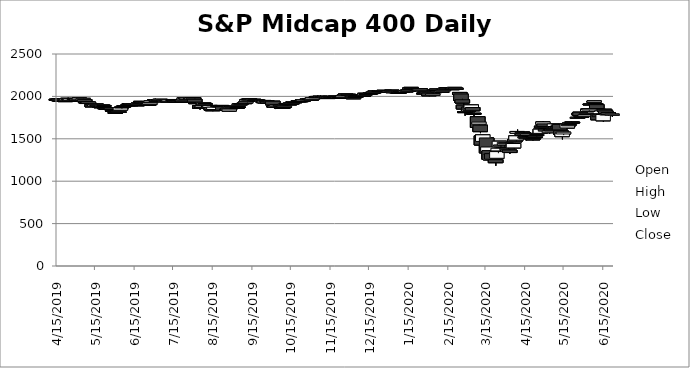
| Category | Open | High | Low | Close |
|---|---|---|---|---|
| 4/15/19 | 1966.51 | 1969.05 | 1958.46 | 1962.01 |
| 4/16/19 | 1966.48 | 1968.69 | 1958.73 | 1963.52 |
| 4/17/19 | 1968.53 | 1970.63 | 1944.52 | 1948.59 |
| 4/18/19 | 1948.67 | 1955.84 | 1942.2 | 1953.43 |
| 4/22/19 | 1950.25 | 1951.26 | 1940.24 | 1946.21 |
| 4/23/19 | 1949.71 | 1974.34 | 1949.71 | 1970.84 |
| 4/24/19 | 1973.05 | 1984.73 | 1972.45 | 1977.67 |
| 4/25/19 | 1970.99 | 1970.99 | 1945.44 | 1955.14 |
| 4/26/19 | 1955.57 | 1975.06 | 1953.91 | 1973.92 |
| 4/29/19 | 1974.74 | 1979.46 | 1971.18 | 1973.94 |
| 4/30/19 | 1973.55 | 1973.83 | 1953.93 | 1970.74 |
| 5/1/19 | 1972.97 | 1974.2 | 1948.83 | 1948.87 |
| 5/2/19 | 1946 | 1958.25 | 1934.3 | 1952.87 |
| 5/3/19 | 1960.55 | 1981.44 | 1960.55 | 1980.83 |
| 5/6/19 | 1956.87 | 1981.59 | 1952.53 | 1976.82 |
| 5/7/19 | 1962.69 | 1964.15 | 1926.4 | 1938.62 |
| 5/8/19 | 1936.06 | 1947.19 | 1931.67 | 1932.14 |
| 5/9/19 | 1918.87 | 1931.06 | 1901.67 | 1927.74 |
| 5/10/19 | 1922.67 | 1938.24 | 1898.47 | 1933.43 |
| 5/13/19 | 1907.51 | 1907.51 | 1870.38 | 1876.57 |
| 5/14/19 | 1881.99 | 1903.37 | 1881.25 | 1894.92 |
| 5/15/19 | 1883.24 | 1903.51 | 1878.37 | 1899.98 |
| 5/16/19 | 1903.67 | 1922.34 | 1903.52 | 1911.41 |
| 5/17/19 | 1898.45 | 1913.13 | 1888.2 | 1889.4 |
| 5/20/19 | 1878.11 | 1885.65 | 1870.73 | 1875.69 |
| 5/21/19 | 1884.42 | 1902.11 | 1884.42 | 1899.74 |
| 5/22/19 | 1893.18 | 1895.48 | 1880.92 | 1885.16 |
| 5/23/19 | 1868.64 | 1868.64 | 1844.36 | 1853.57 |
| 5/24/19 | 1861.53 | 1868.25 | 1855.68 | 1862.83 |
| 5/28/19 | 1864.68 | 1868.88 | 1843.84 | 1844.17 |
| 5/29/19 | 1835.01 | 1837.48 | 1821.07 | 1832.77 |
| 5/30/19 | 1834.12 | 1847.6 | 1820.1 | 1828.67 |
| 5/31/19 | 1812 | 1818.44 | 1802.58 | 1810.5 |
| 6/3/19 | 1813.48 | 1829.86 | 1811.71 | 1822.94 |
| 6/4/19 | 1837.8 | 1869.01 | 1837.36 | 1868.82 |
| 6/5/19 | 1874.66 | 1877.01 | 1854.08 | 1874.71 |
| 6/6/19 | 1875.59 | 1885.87 | 1865.45 | 1881.52 |
| 6/7/19 | 1886.84 | 1899.5 | 1885.55 | 1892 |
| 6/10/19 | 1899.15 | 1914.01 | 1899.01 | 1902.19 |
| 6/11/19 | 1914.4 | 1921.8 | 1897.95 | 1903.88 |
| 6/12/19 | 1901.24 | 1903.92 | 1894.42 | 1901.72 |
| 6/13/19 | 1907.8 | 1913.39 | 1902.64 | 1912.45 |
| 6/14/19 | 1908.98 | 1908.98 | 1898.01 | 1899.92 |
| 6/17/19 | 1900.97 | 1908 | 1897.84 | 1899.56 |
| 6/18/19 | 1908.54 | 1933.61 | 1908.54 | 1921.35 |
| 6/19/19 | 1922.61 | 1928.75 | 1918.66 | 1926.95 |
| 6/20/19 | 1941.58 | 1946.18 | 1926.95 | 1939.94 |
| 6/21/19 | 1934.36 | 1936.49 | 1923.02 | 1928.11 |
| 6/24/19 | 1930.76 | 1931.86 | 1912.65 | 1912.65 |
| 6/25/19 | 1913.96 | 1915.69 | 1900.45 | 1901.33 |
| 6/26/19 | 1907.46 | 1912.08 | 1898.62 | 1898.62 |
| 6/27/19 | 1903.52 | 1923.27 | 1903.52 | 1922.3 |
| 6/28/19 | 1927.02 | 1947.94 | 1927.02 | 1945.51 |
| 7/1/19 | 1963.09 | 1973.1 | 1943.44 | 1952.38 |
| 7/2/19 | 1951.14 | 1952.22 | 1939.61 | 1946.19 |
| 7/3/19 | 1951 | 1963.6 | 1950.03 | 1963.42 |
| 7/5/19 | 1955.82 | 1965.95 | 1943.1 | 1965.95 |
| 7/8/19 | 1958.51 | 1960.5 | 1944.09 | 1947.42 |
| 7/9/19 | 1939.49 | 1947.53 | 1936.47 | 1947.21 |
| 7/10/19 | 1954.61 | 1958.44 | 1941.85 | 1945.83 |
| 7/11/19 | 1947.82 | 1948.1 | 1932.97 | 1940.63 |
| 7/12/19 | 1943.45 | 1963.53 | 1943.45 | 1960.49 |
| 7/15/19 | 1963.5 | 1965.19 | 1947.35 | 1951.36 |
| 7/16/19 | 1947.39 | 1957.82 | 1944.47 | 1951.83 |
| 7/17/19 | 1950.24 | 1950.93 | 1935.8 | 1937.47 |
| 7/18/19 | 1935.48 | 1946.64 | 1931.71 | 1943.6 |
| 7/19/19 | 1947.05 | 1954.59 | 1937.24 | 1937.4 |
| 7/22/19 | 1940.22 | 1944.78 | 1934.8 | 1935.64 |
| 7/23/19 | 1942.97 | 1956.61 | 1939.67 | 1956.2 |
| 7/24/19 | 1954.51 | 1985.37 | 1954.14 | 1983.8 |
| 7/25/19 | 1981.61 | 1981.61 | 1962.93 | 1964.83 |
| 7/26/19 | 1968.92 | 1985.4 | 1968.8 | 1983.14 |
| 7/29/19 | 1982.65 | 1983.95 | 1971.11 | 1973.88 |
| 7/30/19 | 1966 | 1986.88 | 1959.63 | 1986.8 |
| 7/31/19 | 1985.72 | 1991.51 | 1956.34 | 1966.72 |
| 8/1/19 | 1966.56 | 1977.23 | 1926.54 | 1933.48 |
| 8/2/19 | 1926.3 | 1927.19 | 1902.9 | 1914.53 |
| 8/5/19 | 1892.55 | 1892.55 | 1843.73 | 1860.83 |
| 8/6/19 | 1868.67 | 1884.38 | 1860.57 | 1883.5 |
| 8/7/19 | 1868.54 | 1892.33 | 1853.81 | 1887.31 |
| 8/8/19 | 1897.67 | 1925.57 | 1897.67 | 1925.31 |
| 8/9/19 | 1916.45 | 1917.06 | 1896.08 | 1901.33 |
| 8/12/19 | 1892.09 | 1892.09 | 1868.81 | 1872.8 |
| 8/13/19 | 1870.85 | 1912.03 | 1866.66 | 1893.51 |
| 8/14/19 | 1869.92 | 1869.92 | 1836.51 | 1837.99 |
| 8/15/19 | 1842.85 | 1844.37 | 1826.08 | 1835.16 |
| 8/16/19 | 1845.11 | 1875.34 | 1845.1 | 1873.22 |
| 8/19/19 | 1892.48 | 1898.26 | 1889.42 | 1891.71 |
| 8/20/19 | 1888.11 | 1888.11 | 1875.71 | 1876.3 |
| 8/21/19 | 1889.53 | 1891.79 | 1884.17 | 1886.86 |
| 8/22/19 | 1893.41 | 1897.43 | 1878.45 | 1888.46 |
| 8/23/19 | 1878.12 | 1887.05 | 1832.28 | 1836.55 |
| 8/26/19 | 1852.05 | 1853.5 | 1838.79 | 1851.39 |
| 8/27/19 | 1862.71 | 1862.84 | 1831.86 | 1832.63 |
| 8/28/19 | 1828.04 | 1854.49 | 1825.44 | 1849.95 |
| 8/29/19 | 1866.32 | 1880.41 | 1866.32 | 1877.21 |
| 8/30/19 | 1885.9 | 1887.85 | 1871.74 | 1881.2 |
| 9/3/19 | 1869.36 | 1870.53 | 1848.48 | 1858.05 |
| 9/4/19 | 1874.52 | 1881.75 | 1870.82 | 1880.94 |
| 9/5/19 | 1896.24 | 1919.71 | 1895.66 | 1912.63 |
| 9/6/19 | 1914.93 | 1921.04 | 1909.43 | 1911.51 |
| 9/9/19 | 1919.03 | 1926.7 | 1911.53 | 1926.46 |
| 9/10/19 | 1923.82 | 1937.96 | 1911.73 | 1937.8 |
| 9/11/19 | 1942.62 | 1964.11 | 1928.2 | 1964.11 |
| 9/12/19 | 1966.34 | 1968.48 | 1950.89 | 1962.36 |
| 9/13/19 | 1970.22 | 1976.21 | 1961.31 | 1963.16 |
| 9/16/19 | 1953.79 | 1971.38 | 1952.74 | 1966.09 |
| 9/17/19 | 1959.73 | 1959.96 | 1951.69 | 1959.49 |
| 9/18/19 | 1956.33 | 1956.46 | 1937.85 | 1953.43 |
| 9/19/19 | 1957.43 | 1965.75 | 1947.7 | 1949.66 |
| 9/20/19 | 1952.74 | 1960.67 | 1940.84 | 1944.64 |
| 9/23/19 | 1937.34 | 1954.98 | 1936.38 | 1947.83 |
| 9/24/19 | 1952.12 | 1956.83 | 1921.88 | 1925.68 |
| 9/25/19 | 1924.45 | 1951.13 | 1924.19 | 1947.43 |
| 9/26/19 | 1945.96 | 1945.96 | 1930.7 | 1936.97 |
| 9/27/19 | 1941.76 | 1944.29 | 1915.5 | 1922.74 |
| 9/30/19 | 1925.97 | 1940.49 | 1925.7 | 1935.48 |
| 10/1/19 | 1943.24 | 1950.09 | 1897.85 | 1900.02 |
| 10/2/19 | 1887.74 | 1887.74 | 1861.81 | 1873.82 |
| 10/3/19 | 1869.46 | 1884.89 | 1850.94 | 1884.62 |
| 10/4/19 | 1888.06 | 1904.01 | 1881.9 | 1903.79 |
| 10/7/19 | 1897.57 | 1906.89 | 1891.01 | 1894.05 |
| 10/8/19 | 1877.81 | 1879.39 | 1860.86 | 1860.86 |
| 10/9/19 | 1873.67 | 1880.11 | 1865.16 | 1873.79 |
| 10/10/19 | 1876.04 | 1891.22 | 1875.18 | 1884.17 |
| 10/11/19 | 1904.11 | 1932.21 | 1904.11 | 1916.57 |
| 10/14/19 | 1911.31 | 1912.57 | 1902.52 | 1909.03 |
| 10/15/19 | 1913.39 | 1930.06 | 1910.47 | 1924.31 |
| 10/16/19 | 1920.62 | 1929.48 | 1916.93 | 1922.4 |
| 10/17/19 | 1931.98 | 1940.81 | 1927.29 | 1938.65 |
| 10/18/19 | 1933.79 | 1940.46 | 1926.22 | 1936.76 |
| 10/21/19 | 1948.27 | 1955.28 | 1946.55 | 1947.66 |
| 10/22/19 | 1949.69 | 1957.27 | 1942.56 | 1947.08 |
| 10/23/19 | 1949.31 | 1950.27 | 1941.59 | 1948.71 |
| 10/24/19 | 1957.69 | 1957.69 | 1940.64 | 1949.6 |
| 10/25/19 | 1946.18 | 1964.43 | 1946.18 | 1959.22 |
| 10/28/19 | 1967.66 | 1980.04 | 1967.66 | 1970.61 |
| 10/29/19 | 1966.53 | 1980.49 | 1962.5 | 1975.24 |
| 10/30/19 | 1972.31 | 1973.15 | 1959.75 | 1969.94 |
| 10/31/19 | 1967.8 | 1967.81 | 1946.64 | 1955.37 |
| 11/1/19 | 1966.35 | 1983.53 | 1965.51 | 1983.5 |
| 11/4/19 | 1995.39 | 1997.27 | 1987.88 | 1995.1 |
| 11/5/19 | 1999.39 | 2009.91 | 1997.87 | 1999.33 |
| 11/6/19 | 1997.71 | 1997.71 | 1985.73 | 1990.35 |
| 11/7/19 | 2001.91 | 2009.98 | 1988.88 | 1992.64 |
| 11/8/19 | 1989.39 | 1998.5 | 1985.94 | 1998.39 |
| 11/11/19 | 1987.29 | 1998.88 | 1985.73 | 1994.46 |
| 11/12/19 | 1995.29 | 2002.49 | 1988.5 | 1990.99 |
| 11/13/19 | 1980.93 | 1990.85 | 1978.17 | 1986.46 |
| 11/14/19 | 1983.88 | 1993.07 | 1982.83 | 1991.46 |
| 11/15/19 | 1999.58 | 2003.09 | 1994.41 | 2000.61 |
| 11/18/19 | 1996.6 | 1998.39 | 1992.34 | 1997.91 |
| 11/19/19 | 2003.32 | 2006.02 | 1994.17 | 2001.35 |
| 11/20/19 | 1994.35 | 2005.03 | 1982.3 | 1994.17 |
| 11/21/19 | 1997.11 | 1997.11 | 1978.75 | 1980.44 |
| 11/22/19 | 1986.99 | 1988.65 | 1979.03 | 1985.87 |
| 11/25/19 | 1991.12 | 2011.91 | 1991.12 | 2009.7 |
| 11/26/19 | 2009.95 | 2019.92 | 2007.2 | 2018.02 |
| 11/27/19 | 2022.45 | 2031 | 2020.04 | 2030.78 |
| 11/29/19 | 2025.3 | 2027.87 | 2009.13 | 2010.15 |
| 12/2/19 | 2013.28 | 2013.28 | 1995.42 | 1995.86 |
| 12/3/19 | 1977.21 | 1985.23 | 1969.37 | 1983.92 |
| 12/4/19 | 1991.2 | 2011.38 | 1991.2 | 1999.53 |
| 12/5/19 | 2003.68 | 2007.12 | 1996.96 | 2003 |
| 12/6/19 | 2017.66 | 2029.53 | 2017.52 | 2021.98 |
| 12/9/19 | 2019.62 | 2021.62 | 2013.46 | 2013.48 |
| 12/10/19 | 2011.92 | 2016.06 | 2007.54 | 2011.75 |
| 12/11/19 | 2013.38 | 2017.5 | 2009.02 | 2015.75 |
| 12/12/19 | 2016.01 | 2040.93 | 2012.95 | 2036.63 |
| 12/13/19 | 2034.53 | 2043.24 | 2019.82 | 2024.72 |
| 12/16/19 | 2034.64 | 2047.07 | 2034.64 | 2038.46 |
| 12/17/19 | 2040.85 | 2045.79 | 2038.08 | 2045.09 |
| 12/18/19 | 2047.45 | 2048.1 | 2039.29 | 2046.15 |
| 12/19/19 | 2046.19 | 2055.29 | 2044.52 | 2054.31 |
| 12/20/19 | 2060.34 | 2069.95 | 2060.34 | 2065.61 |
| 12/23/19 | 2069.29 | 2069.29 | 2058.98 | 2063.39 |
| 12/24/19 | 2065.65 | 2065.65 | 2061.36 | 2061.36 |
| 12/26/19 | 2064.99 | 2068.81 | 2062.06 | 2067.33 |
| 12/27/19 | 2071.85 | 2071.85 | 2060 | 2062.88 |
| 12/30/19 | 2063.38 | 2066.89 | 2054.11 | 2060.72 |
| 12/31/19 | 2056.33 | 2069.47 | 2055.45 | 2063.02 |
| 1/2/20 | 2073.7 | 2073.72 | 2047.03 | 2065.19 |
| 1/3/20 | 2046.12 | 2059.28 | 2040.76 | 2055.67 |
| 1/6/20 | 2043.95 | 2055.56 | 2037.07 | 2054.16 |
| 1/7/20 | 2050.13 | 2054.22 | 2043.7 | 2049.34 |
| 1/8/20 | 2050.31 | 2060.32 | 2046.69 | 2052.93 |
| 1/9/20 | 2060.78 | 2061.89 | 2052.77 | 2058.05 |
| 1/10/20 | 2059.65 | 2060.05 | 2047.7 | 2051.37 |
| 1/13/20 | 2052.65 | 2068.42 | 2049.84 | 2068.13 |
| 1/14/20 | 2065.76 | 2079.95 | 2063 | 2072.99 |
| 1/15/20 | 2069.16 | 2084.5 | 2068.55 | 2076.1 |
| 1/16/20 | 2087.86 | 2100.34 | 2087.22 | 2100.34 |
| 1/17/20 | 2106.3 | 2106.3 | 2093.03 | 2095.55 |
| 1/21/20 | 2090.08 | 2090.36 | 2080.73 | 2082.93 |
| 1/22/20 | 2090.28 | 2094.79 | 2079.53 | 2082.52 |
| 1/23/20 | 2079.6 | 2090.35 | 2065.37 | 2086.86 |
| 1/24/20 | 2090.88 | 2090.88 | 2054.38 | 2065.15 |
| 1/27/20 | 2039.35 | 2047.5 | 2030.82 | 2035.97 |
| 1/28/20 | 2047.08 | 2061.87 | 2044.6 | 2056.38 |
| 1/29/20 | 2060.66 | 2064.95 | 2046.63 | 2046.66 |
| 1/30/20 | 2034.91 | 2048.57 | 2025.79 | 2047.92 |
| 1/31/20 | 2039.5 | 2041.52 | 2002.33 | 2007.22 |
| 2/3/20 | 2014.84 | 2038.51 | 2014.84 | 2028.61 |
| 2/4/20 | 2048.04 | 2064.22 | 2048.04 | 2055.7 |
| 2/5/20 | 2071.49 | 2081.88 | 2069.25 | 2080.32 |
| 2/6/20 | 2086.77 | 2086.77 | 2069.56 | 2069.69 |
| 2/7/20 | 2063.25 | 2063.25 | 2047.28 | 2049.3 |
| 2/10/20 | 2046.1 | 2060.84 | 2045.16 | 2060.84 |
| 2/11/20 | 2069.91 | 2085.34 | 2069.91 | 2076.67 |
| 2/12/20 | 2087.19 | 2091.78 | 2081.88 | 2091.35 |
| 2/13/20 | 2082.86 | 2100.44 | 2079.65 | 2097.29 |
| 2/14/20 | 2099.3 | 2100.57 | 2089.61 | 2096.61 |
| 2/18/20 | 2091.06 | 2095.1 | 2078.55 | 2089.19 |
| 2/19/20 | 2093.62 | 2106.17 | 2093.62 | 2098.57 |
| 2/20/20 | 2096.01 | 2109.43 | 2084.56 | 2106.12 |
| 2/21/20 | 2098.52 | 2098.52 | 2079.34 | 2084.33 |
| 2/24/20 | 2046.63 | 2046.63 | 2013.14 | 2022.57 |
| 2/25/20 | 2028.36 | 2029.88 | 1950.09 | 1951.94 |
| 2/26/20 | 1960.64 | 1973.18 | 1921.51 | 1921.97 |
| 2/27/20 | 1897.2 | 1919.92 | 1848.51 | 1851.81 |
| 2/28/20 | 1820.61 | 1829.4 | 1771.67 | 1814 |
| 3/2/20 | 1823.22 | 1875.67 | 1796 | 1875.47 |
| 3/3/20 | 1876.89 | 1906.86 | 1820.01 | 1835.19 |
| 3/4/20 | 1858.94 | 1900.21 | 1851.62 | 1899.66 |
| 3/5/20 | 1869.08 | 1869.08 | 1811.66 | 1830.62 |
| 3/6/20 | 1801.01 | 1810.46 | 1757.17 | 1797.79 |
| 3/9/20 | 1760.1 | 1760.1 | 1624.78 | 1633.64 |
| 3/10/20 | 1673.27 | 1696.67 | 1609.83 | 1696.67 |
| 3/11/20 | 1660.67 | 1660.67 | 1566.83 | 1584.67 |
| 3/12/20 | 1534.73 | 1534.73 | 1417.97 | 1426.74 |
| 3/13/20 | 1468.97 | 1546.98 | 1416.9 | 1546.98 |
| 3/16/20 | 1509.81 | 1509.81 | 1332.72 | 1334.12 |
| 3/17/20 | 1350.76 | 1403.95 | 1309.37 | 1403.28 |
| 3/18/20 | 1361.15 | 1361.15 | 1214.57 | 1258.24 |
| 3/19/20 | 1251.41 | 1335.56 | 1215.51 | 1317.54 |
| 3/20/20 | 1325.15 | 1354.67 | 1253.91 | 1258.73 |
| 3/23/20 | 1253.53 | 1253.53 | 1181.88 | 1218.55 |
| 3/24/20 | 1270.2 | 1349.55 | 1270.2 | 1349.04 |
| 3/25/20 | 1357.2 | 1443.77 | 1329.98 | 1388.86 |
| 3/26/20 | 1404.68 | 1472.59 | 1403.94 | 1471.53 |
| 3/27/20 | 1427.69 | 1458.37 | 1403.68 | 1422.92 |
| 3/30/20 | 1426.53 | 1460.22 | 1402.83 | 1459.15 |
| 3/31/20 | 1452.8 | 1463.69 | 1422.74 | 1443.4 |
| 4/1/20 | 1391.99 | 1393.49 | 1349.92 | 1361.21 |
| 4/2/20 | 1351.92 | 1404.15 | 1341.57 | 1375.35 |
| 4/3/20 | 1367.41 | 1379.09 | 1322.75 | 1337.95 |
| 4/6/20 | 1392.55 | 1448.59 | 1392.55 | 1444.56 |
| 4/7/20 | 1492.33 | 1528.41 | 1460.43 | 1463.92 |
| 4/8/20 | 1484.54 | 1541.26 | 1468.85 | 1535.51 |
| 4/9/20 | 1566.53 | 1609.34 | 1563.31 | 1586.37 |
| 4/13/20 | 1580.35 | 1580.35 | 1521.17 | 1537.47 |
| 4/14/20 | 1570.53 | 1588.04 | 1553.89 | 1570.52 |
| 4/15/20 | 1526.13 | 1526.13 | 1500.68 | 1508.8 |
| 4/16/20 | 1511.75 | 1514.84 | 1481.61 | 1505.64 |
| 4/17/20 | 1545.85 | 1571.15 | 1545.7 | 1561.43 |
| 4/20/20 | 1537.02 | 1559.88 | 1525.43 | 1532.49 |
| 4/21/20 | 1499.48 | 1510.07 | 1481.01 | 1490.58 |
| 4/22/20 | 1520.94 | 1526.52 | 1504.75 | 1512.86 |
| 4/23/20 | 1521.03 | 1551.33 | 1520.75 | 1529.01 |
| 4/24/20 | 1541.5 | 1556.89 | 1523.09 | 1550.37 |
| 4/27/20 | 1564.01 | 1621.74 | 1564.01 | 1613.53 |
| 4/28/20 | 1649.28 | 1662.02 | 1615.75 | 1629.89 |
| 4/29/20 | 1671.98 | 1709.51 | 1667.32 | 1698.26 |
| 4/30/20 | 1675.43 | 1675.43 | 1645.48 | 1646.36 |
| 5/1/20 | 1614.85 | 1614.85 | 1573.89 | 1590.48 |
| 5/4/20 | 1571.79 | 1592.4 | 1558.05 | 1591.5 |
| 5/5/20 | 1613.49 | 1639.07 | 1603.68 | 1607.11 |
| 5/6/20 | 1616.04 | 1622.5 | 1593.25 | 1593.77 |
| 5/7/20 | 1611 | 1636.47 | 1611 | 1620.08 |
| 5/8/20 | 1645.03 | 1677.52 | 1643.94 | 1676.18 |
| 5/11/20 | 1658.69 | 1676.76 | 1643.14 | 1663.48 |
| 5/12/20 | 1669.82 | 1674.3 | 1604.8 | 1604.8 |
| 5/13/20 | 1595.08 | 1595.53 | 1535 | 1550.7 |
| 5/14/20 | 1525.61 | 1567.39 | 1492.88 | 1567.15 |
| 5/15/20 | 1557.1 | 1583.39 | 1543.52 | 1578.26 |
| 5/18/20 | 1627.69 | 1682.51 | 1627.69 | 1674.06 |
| 5/19/20 | 1669.87 | 1688.49 | 1652.63 | 1652.63 |
| 5/20/20 | 1678.2 | 1697.78 | 1678.2 | 1688.63 |
| 5/21/20 | 1684.9 | 1701.74 | 1676.49 | 1694.18 |
| 5/22/20 | 1697.41 | 1698.05 | 1678.2 | 1695.33 |
| 5/26/20 | 1742.47 | 1765.24 | 1742.47 | 1753.03 |
| 5/27/20 | 1784.36 | 1799.66 | 1746.53 | 1799.27 |
| 5/28/20 | 1813.53 | 1815.97 | 1766.82 | 1773.12 |
| 5/29/20 | 1759.66 | 1772.02 | 1741.66 | 1763.95 |
| 6/1/20 | 1767.04 | 1795.3 | 1762.03 | 1784.04 |
| 6/2/20 | 1796.25 | 1804.78 | 1785.7 | 1800.62 |
| 6/3/20 | 1822.89 | 1856.43 | 1822.89 | 1849.61 |
| 6/4/20 | 1839.03 | 1858.64 | 1830.03 | 1852.2 |
| 6/5/20 | 1907.92 | 1939.47 | 1905.44 | 1911.15 |
| 6/8/20 | 1929.44 | 1946.22 | 1926.51 | 1946.21 |
| 6/9/20 | 1916.26 | 1919.71 | 1895.27 | 1905.37 |
| 6/10/20 | 1902.75 | 1902.75 | 1853.11 | 1857.46 |
| 6/11/20 | 1791.27 | 1791.27 | 1721.71 | 1724.62 |
| 6/12/20 | 1782.23 | 1793.74 | 1713.15 | 1759.91 |
| 6/15/20 | 1712.68 | 1795.73 | 1700.32 | 1786.5 |
| 6/16/20 | 1848.1 | 1855.75 | 1797.6 | 1823.44 |
| 6/17/20 | 1828.79 | 1828.9 | 1795.49 | 1798.37 |
| 6/18/20 | 1784.36 | 1809.66 | 1779.12 | 1792.81 |
| 6/19/20 | 1809.17 | 1816.79 | 1770.91 | 1784.72 |
| 6/22/20 | 1778.27 | 1793.83 | 1757.44 | 1790.34 |